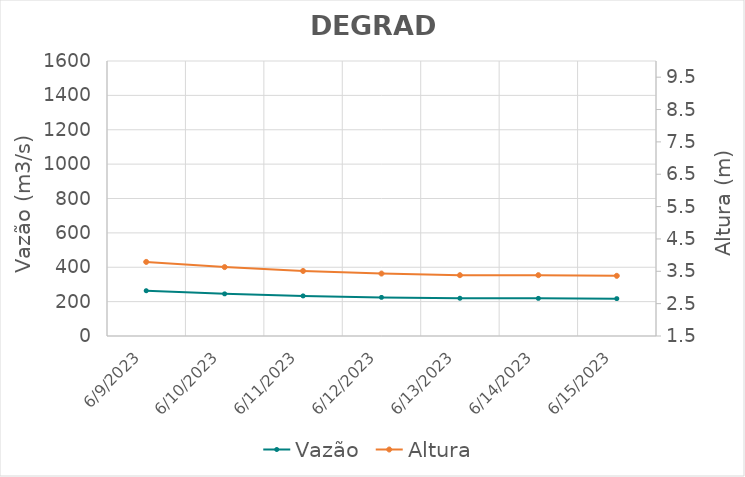
| Category | Vazão |
|---|---|
| 4/26/22 | 772.27 |
| 4/25/22 | 760.98 |
| 4/24/22 | 723 |
| 4/23/22 | 658.5 |
| 4/22/22 | 589.73 |
| 4/21/22 | 524.85 |
| 4/20/22 | 493.58 |